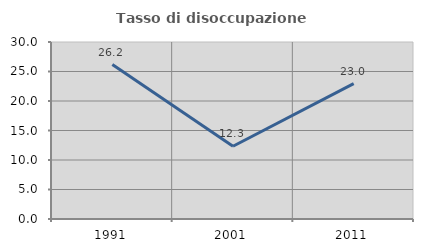
| Category | Tasso di disoccupazione giovanile  |
|---|---|
| 1991.0 | 26.174 |
| 2001.0 | 12.329 |
| 2011.0 | 22.951 |